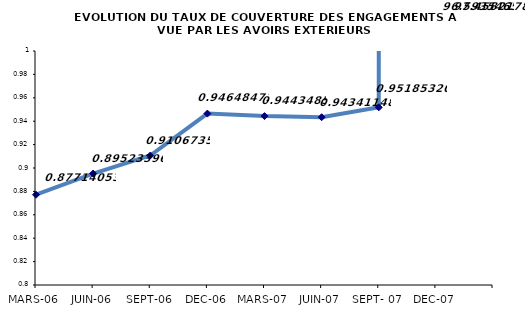
| Category | Series 0 |
|---|---|
| _x0007_MARS-06 | 0.877 |
| _x0007_JUIN-06 | 0.895 |
| _x0007_SEPT-06 | 0.911 |
| _x0006_DEC-06 | 0.946 |
| _x0007_MARS-07 | 0.944 |
| _x0007_JUIN-07 | 0.943 |
| _x0008_SEPT- 07 | 0.952 |
| _x0006_DEC-07 | 96.594 |